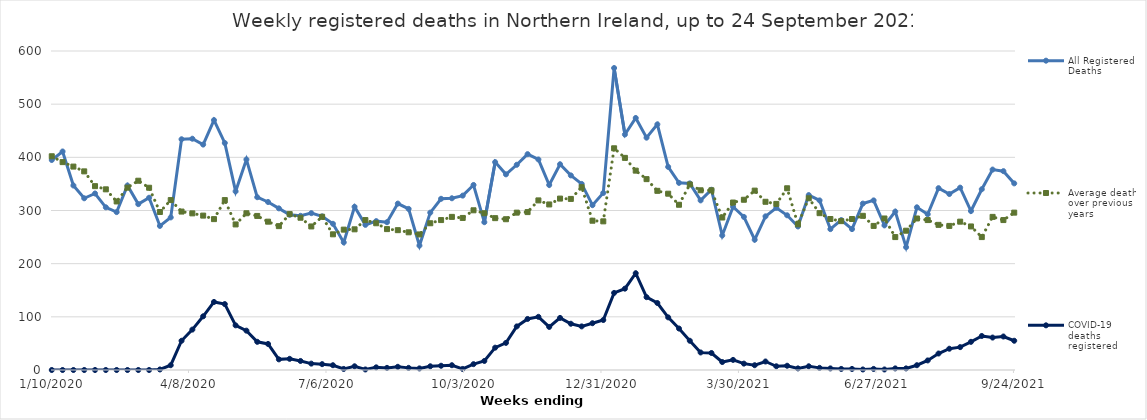
| Category | All Registered Deaths | Average deaths over previous 5 years | COVID-19 deaths registered |
|---|---|---|---|
| 1/10/20 | 395 | 402 | 0 |
| 1/17/20 | 411 | 391 | 0 |
| 1/24/20 | 347 | 382.6 | 0 |
| 1/31/20 | 323 | 373.6 | 0 |
| 2/7/20 | 332 | 345.8 | 0 |
| 2/14/20 | 306 | 339.8 | 0 |
| 2/21/20 | 297 | 317 | 0 |
| 2/28/20 | 347 | 343 | 0 |
| 3/6/20 | 312 | 356 | 0 |
| 3/13/20 | 324 | 342.8 | 0 |
| 3/20/20 | 271 | 297.2 | 1 |
| 3/27/20 | 287 | 319.6 | 9 |
| 4/3/20 | 434 | 298 | 55 |
| 4/10/20 | 435 | 294.6 | 76 |
| 4/17/20 | 424 | 290.4 | 101 |
| 4/24/20 | 470 | 283.8 | 128 |
| 5/1/20 | 427 | 319.6 | 124 |
| 5/8/20 | 336 | 273.8 | 84 |
| 5/15/20 | 396 | 294.8 | 74 |
| 5/22/20 | 325 | 289.8 | 53 |
| 5/29/20 | 316 | 279 | 49 |
| 6/5/20 | 304 | 270.6 | 20 |
| 6/12/20 | 292 | 293.2 | 21 |
| 6/19/20 | 290 | 286.4 | 17 |
| 6/26/20 | 295 | 270 | 12 |
| 7/3/20 | 289 | 288.2 | 11 |
| 7/10/20 | 275 | 255.2 | 9 |
| 7/17/20 | 240 | 264 | 2 |
| 7/24/20 | 307 | 264.6 | 7 |
| 7/31/20 | 273 | 282 | 1 |
| 8/7/20 | 280 | 276 | 5 |
| 8/14/20 | 278 | 265 | 4 |
| 8/21/20 | 313 | 263 | 6 |
| 8/28/20 | 303 | 259 | 4 |
| 9/4/20 | 234 | 255 | 3 |
| 9/11/20 | 296 | 276 | 7 |
| 9/18/20 | 322 | 282 | 8 |
| 9/25/20 | 323 | 288 | 9 |
| 10/2/20 | 328 | 286 | 2 |
| 10/9/20 | 348 | 300.4 | 11 |
| 10/16/20 | 278 | 294.8 | 17 |
| 10/23/20 | 391 | 285.6 | 42 |
| 10/30/20 | 368 | 283.6 | 51 |
| 11/6/20 | 386 | 296 | 82 |
| 11/13/20 | 406 | 297 | 96 |
| 11/20/20 | 396 | 319 | 100 |
| 11/27/20 | 348 | 311.4 | 81 |
| 12/4/20 | 387 | 322.4 | 98 |
| 12/11/20 | 366 | 321.8 | 87 |
| 12/18/20 | 350 | 343.8 | 82 |
| 12/25/20 | 310 | 280.8 | 88 |
| 1/1/21 | 333 | 279.6 | 94 |
| 1/8/21 | 568 | 417 | 145 |
| 1/15/21 | 443 | 399 | 153 |
| 1/22/21 | 474 | 375 | 182 |
| 1/29/21 | 437 | 359 | 137 |
| 2/5/21 | 462 | 337 | 126 |
| 2/12/21 | 382 | 331.6 | 99 |
| 2/19/21 | 352 | 310.8 | 78 |
| 2/26/21 | 351 | 349 | 55 |
| 3/5/21 | 319 | 338 | 33 |
| 3/12/21 | 339 | 338 | 32 |
| 3/19/21 | 253 | 286.8 | 15 |
| 3/26/21 | 307 | 315 | 19 |
| 4/2/21 | 288 | 320.2 | 12 |
| 4/9/21 | 245 | 337.4 | 9 |
| 4/16/21 | 289 | 316.4 | 16 |
| 4/23/21 | 305 | 312.4 | 7 |
| 4/30/21 | 291 | 341.8 | 8 |
| 5/7/21 | 270 | 274 | 3 |
| 5/14/21 | 329 | 323 | 7 |
| 5/21/21 | 319 | 295 | 4 |
| 5/28/21 | 265 | 284 | 3 |
| 6/4/21 | 282 | 280 | 2 |
| 6/11/21 | 265 | 284 | 2 |
| 6/18/21 | 313 | 290 | 1 |
| 6/25/21 | 319 | 271 | 2 |
| 7/2/21 | 272 | 285 | 1 |
| 7/9/21 | 298 | 250 | 3 |
| 7/16/21 | 231 | 262 | 3 |
| 7/23/21 | 306 | 285 | 9 |
| 7/30/21 | 293 | 282 | 18 |
| 8/6/21 | 342 | 273 | 31 |
| 8/13/21 | 331 | 271 | 40 |
| 8/20/21 | 343 | 279 | 43 |
| 8/27/21 | 299 | 270 | 53 |
| 9/3/21 | 340 | 250 | 64 |
| 9/10/21 | 377 | 288 | 61 |
| 9/17/21 | 374 | 282 | 63 |
| 9/24/21 | 351 | 296 | 55 |